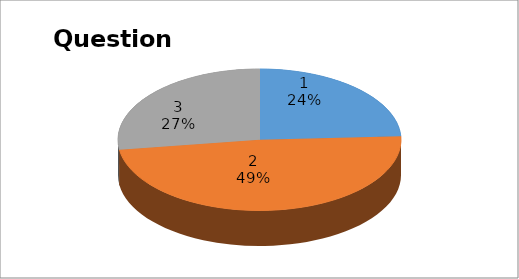
| Category | Series 0 |
|---|---|
| 0 | 8 |
| 1 | 16 |
| 2 | 9 |